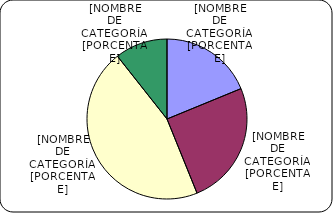
| Category | Series 0 |
|---|---|
| Entre 1-5 años | 2329.7 |
| Entre 6-10 años | 3107.1 |
| Entre 11-20 años | 5636.8 |
| Mayores de 20 años | 1318.4 |